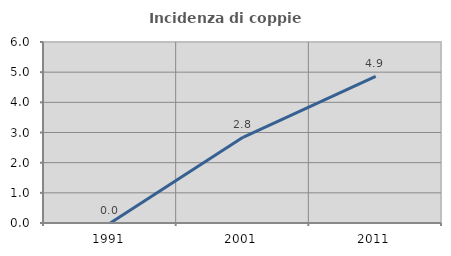
| Category | Incidenza di coppie miste |
|---|---|
| 1991.0 | 0 |
| 2001.0 | 2.839 |
| 2011.0 | 4.861 |